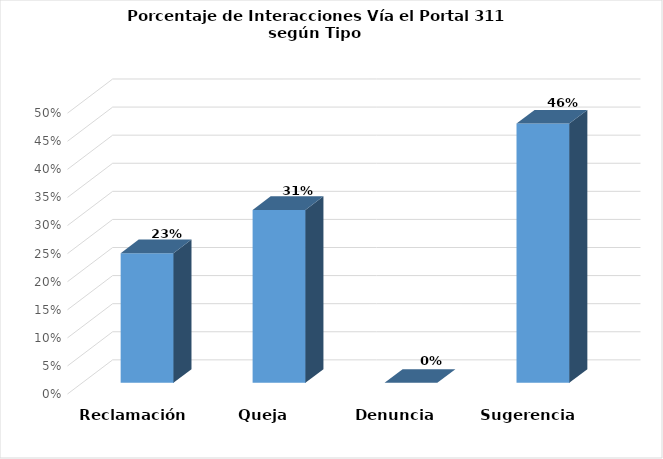
| Category | Series 0 |
|---|---|
| Reclamación | 0.231 |
| Queja | 0.308 |
| Denuncia | 0 |
| Sugerencia | 0.462 |